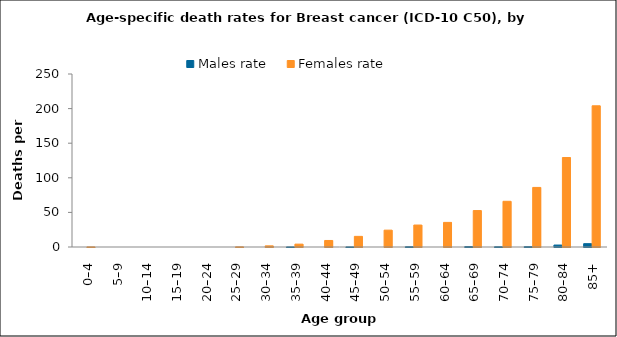
| Category | Males rate | Females rate |
|---|---|---|
| 0–4 | 0 | 0.136 |
| 5–9 | 0 | 0 |
| 10–14 | 0 | 0 |
| 15–19 | 0 | 0 |
| 20–24 | 0 | 0 |
| 25–29 | 0 | 0.221 |
| 30–34 | 0 | 1.668 |
| 35–39 | 0.108 | 4.153 |
| 40–44 | 0 | 9.42 |
| 45–49 | 0.122 | 15.371 |
| 50–54 | 0 | 24.346 |
| 55–59 | 0.393 | 31.727 |
| 60–64 | 0 | 35.552 |
| 65–69 | 0.648 | 52.671 |
| 70–74 | 0.361 | 66.038 |
| 75–79 | 0.516 | 86.085 |
| 80–84 | 2.8 | 129.296 |
| 85+ | 4.789 | 204.03 |